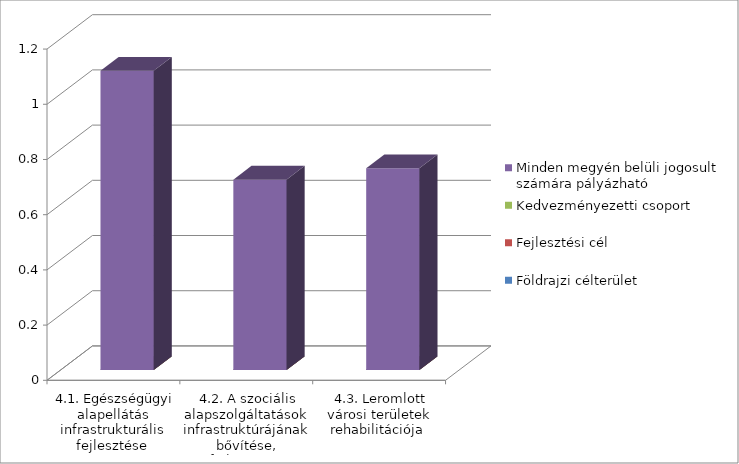
| Category | Földrajzi célterület  | Fejlesztési cél  | Kedvezményezetti csoport | Minden megyén belüli jogosult számára pályázható   |
|---|---|---|---|---|
| 4.1. Egészségügyi alapellátás infrastrukturális fejlesztése | 0 | 0 | 0 | 1.084 |
| 4.2. A szociális alapszolgáltatások infrastruktúrájának bővítése, fejlesztése | 0 | 0 | 0 | 0.69 |
| 4.3. Leromlott városi területek rehabilitációja | 0 | 0 | 0 | 0.731 |